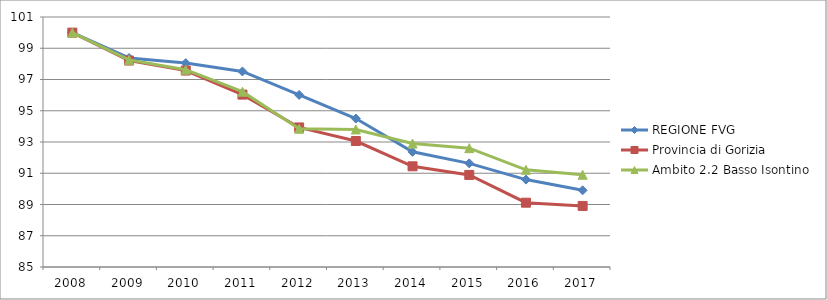
| Category | REGIONE FVG | Provincia di Gorizia | Ambito 2.2 Basso Isontino |
|---|---|---|---|
| 2008.0 | 100 | 100 | 100 |
| 2009.0 | 98.378 | 98.214 | 98.256 |
| 2010.0 | 98.049 | 97.573 | 97.626 |
| 2011.0 | 97.515 | 96.033 | 96.218 |
| 2012.0 | 96.012 | 93.931 | 93.845 |
| 2013.0 | 94.5 | 93.063 | 93.803 |
| 2014.0 | 92.37 | 91.445 | 92.899 |
| 2015.0 | 91.632 | 90.892 | 92.605 |
| 2016.0 | 90.595 | 89.116 | 91.218 |
| 2017.0 | 89.908 | 88.909 | 90.903 |